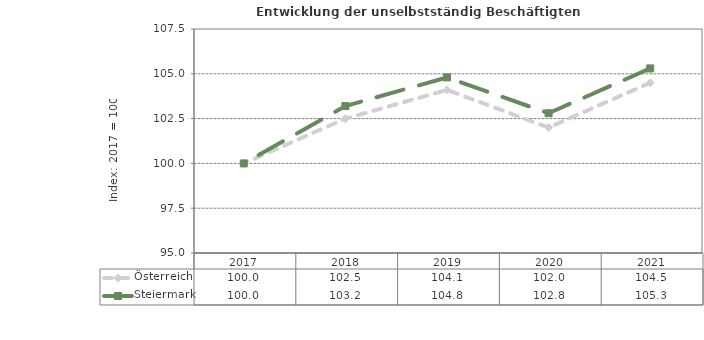
| Category | Österreich | Steiermark |
|---|---|---|
| 2021.0 | 104.5 | 105.3 |
| 2020.0 | 102 | 102.8 |
| 2019.0 | 104.1 | 104.8 |
| 2018.0 | 102.5 | 103.2 |
| 2017.0 | 100 | 100 |